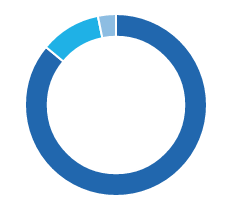
| Category | Series 0 |
|---|---|
| ● Green, Social and Sustainability bonds | 0.86 |
| ● Impact private equity | 0.108 |
| ● Impact infrastructure private debt | 0.032 |